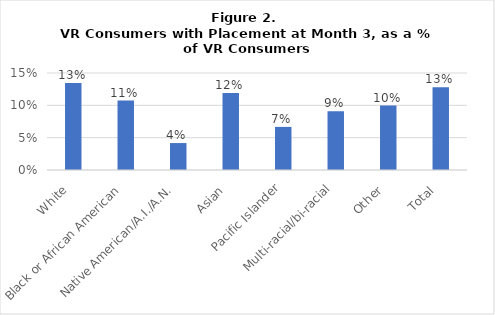
| Category | VR Consumers with 3 Mos. Placement as a % of VR Consumers |
|---|---|
| White  | 0.135 |
| Black or African American  | 0.107 |
| Native American/A.I./A.N.  | 0.042 |
| Asian  | 0.119 |
| Pacific Islander | 0.067 |
| Multi-racial/bi-racial | 0.091 |
| Other  | 0.1 |
| Total  | 0.128 |